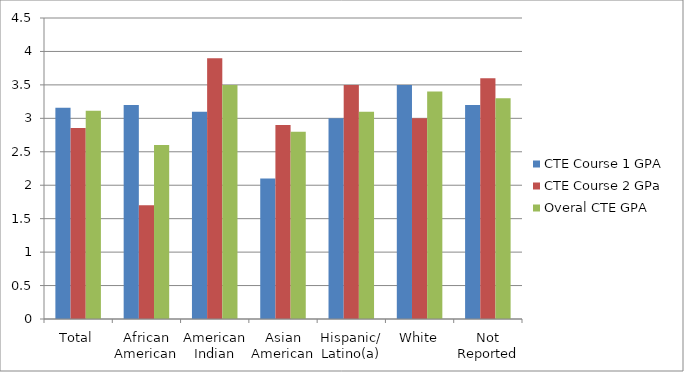
| Category | CTE Course 1 GPA | CTE Course 2 GPa | Overal CTE GPA |
|---|---|---|---|
| Total | 3.16 | 2.854 | 3.114 |
| African American | 3.2 | 1.7 | 2.6 |
| American Indian | 3.1 | 3.9 | 3.5 |
| Asian American | 2.1 | 2.9 | 2.8 |
| Hispanic/ Latino(a) | 3 | 3.5 | 3.1 |
| White | 3.5 | 3 | 3.4 |
| Not Reported | 3.2 | 3.6 | 3.3 |